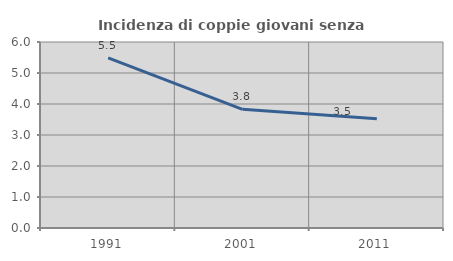
| Category | Incidenza di coppie giovani senza figli |
|---|---|
| 1991.0 | 5.489 |
| 2001.0 | 3.829 |
| 2011.0 | 3.521 |